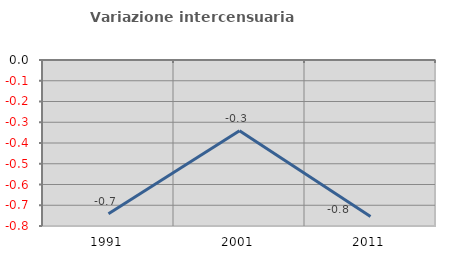
| Category | Variazione intercensuaria annua |
|---|---|
| 1991.0 | -0.741 |
| 2001.0 | -0.341 |
| 2011.0 | -0.754 |